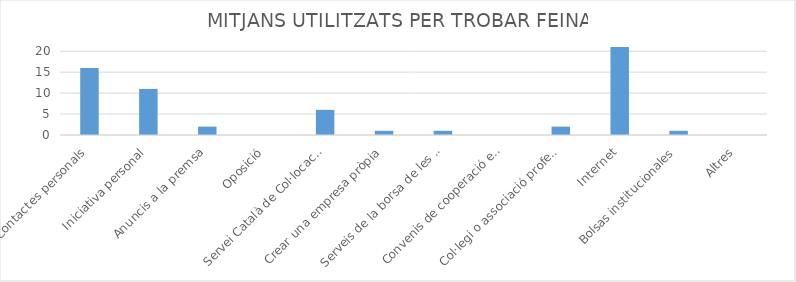
| Category | Series 0 |
|---|---|
| Contactes personals | 16 |
| Iniciativa personal | 11 |
| Anuncis a la premsa | 2 |
| Oposició | 0 |
| Servei Català de Col·locació | 6 |
| Crear una empresa pròpia | 1 |
| Serveis de la borsa de les universitats | 1 |
| Convenis de cooperació educativa | 0 |
| Col·legi o associació professional | 2 |
| Internet | 21 |
| Bolsas institucionales | 1 |
| Altres | 0 |